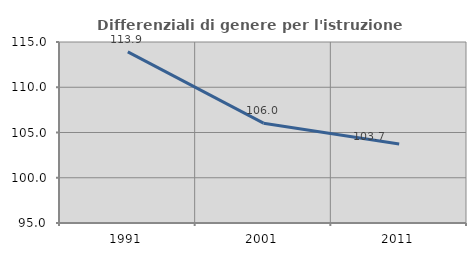
| Category | Differenziali di genere per l'istruzione superiore |
|---|---|
| 1991.0 | 113.916 |
| 2001.0 | 106.028 |
| 2011.0 | 103.734 |